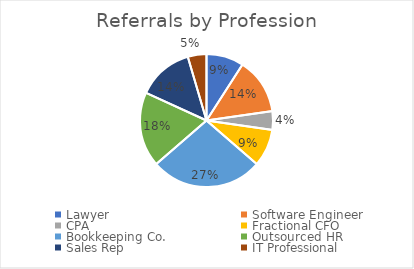
| Category | Referrals by Profession |
|---|---|
| Lawyer | 2 |
| Software Engineer | 3 |
| CPA | 1 |
| Fractional CFO | 2 |
| Bookkeeping Co. | 6 |
| Outsourced HR | 4 |
| Sales Rep | 3 |
| IT Professional | 1 |